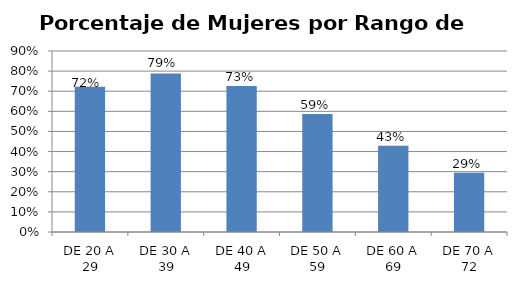
| Category | Porcentaje |
|---|---|
| DE 20 A 29 | 0.722 |
| DE 30 A 39 | 0.788 |
| DE 40 A 49 | 0.726 |
| DE 50 A 59 | 0.587 |
| DE 60 A 69 | 0.429 |
| DE 70 A 72 | 0.294 |